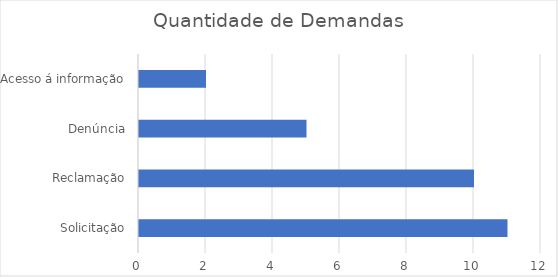
| Category | Series 0 |
|---|---|
| Solicitação | 11 |
| Reclamação | 10 |
| Denúncia | 5 |
| Acesso á informação | 2 |